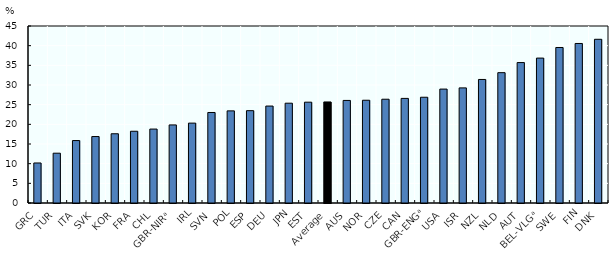
| Category | Percentage of jobs with high HPWP (left) |
|---|---|
| GRC | 10.175 |
| TUR | 12.662 |
| ITA | 15.876 |
| SVK | 16.898 |
| KOR | 17.606 |
| FRA | 18.238 |
| CHL | 18.796 |
| GBR-NIRᵃ | 19.849 |
| IRL | 20.31 |
| SVN | 23.012 |
| POL | 23.425 |
| ESP | 23.474 |
| DEU | 24.648 |
| JPN | 25.373 |
| EST | 25.634 |
| Average | 25.692 |
| AUS | 26.077 |
| NOR | 26.124 |
| CZE | 26.383 |
| CAN | 26.593 |
| GBR-ENGᵃ | 26.887 |
| USA | 28.962 |
| ISR | 29.262 |
| NZL | 31.407 |
| NLD | 33.138 |
| AUT | 35.704 |
| BEL-VLGᵃ | 36.841 |
| SWE | 39.535 |
| FIN | 40.555 |
| DNK | 41.622 |